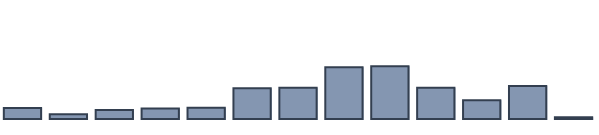
| Category | Series 0 |
|---|---|
| 0 | 3.7 |
| 1 | 1.6 |
| 2 | 3 |
| 3 | 3.5 |
| 4 | 3.8 |
| 5 | 10.3 |
| 6 | 10.5 |
| 7 | 17.4 |
| 8 | 17.7 |
| 9 | 10.5 |
| 10 | 6.3 |
| 11 | 11.1 |
| 12 | 0.6 |